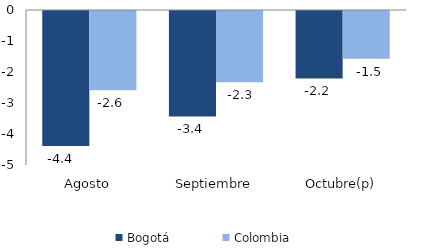
| Category | Bogotá | Colombia |
|---|---|---|
| Agosto | -4.358 | -2.559 |
| Septiembre | -3.402 | -2.302 |
| Octubre(p) | -2.175 | -1.537 |